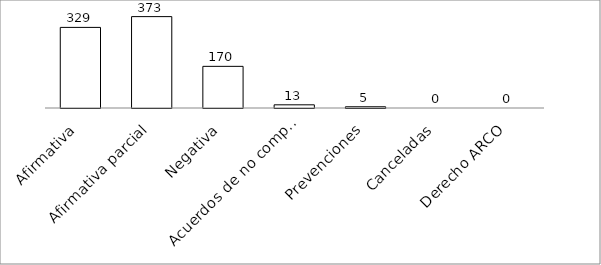
| Category | Series 0 |
|---|---|
| Afirmativa | 329 |
| Afirmativa parcial | 373 |
| Negativa | 170 |
| Acuerdos de no competencia | 13 |
| Prevenciones | 5 |
| Canceladas | 0 |
| Derecho ARCO | 0 |